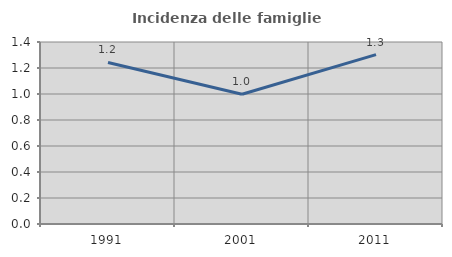
| Category | Incidenza delle famiglie numerose |
|---|---|
| 1991.0 | 1.242 |
| 2001.0 | 0.998 |
| 2011.0 | 1.303 |